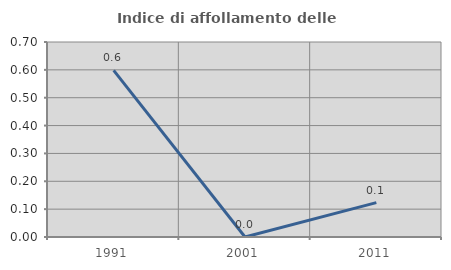
| Category | Indice di affollamento delle abitazioni  |
|---|---|
| 1991.0 | 0.598 |
| 2001.0 | 0 |
| 2011.0 | 0.123 |